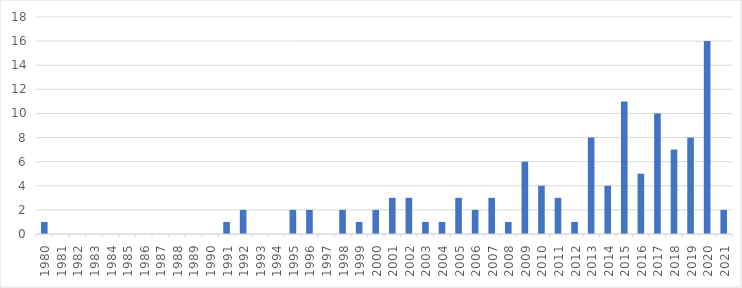
| Category | No. of articles, by year |
|---|---|
| 1980.0 | 1 |
| 1981.0 | 0 |
| 1982.0 | 0 |
| 1983.0 | 0 |
| 1984.0 | 0 |
| 1985.0 | 0 |
| 1986.0 | 0 |
| 1987.0 | 0 |
| 1988.0 | 0 |
| 1989.0 | 0 |
| 1990.0 | 0 |
| 1991.0 | 1 |
| 1992.0 | 2 |
| 1993.0 | 0 |
| 1994.0 | 0 |
| 1995.0 | 2 |
| 1996.0 | 2 |
| 1997.0 | 0 |
| 1998.0 | 2 |
| 1999.0 | 1 |
| 2000.0 | 2 |
| 2001.0 | 3 |
| 2002.0 | 3 |
| 2003.0 | 1 |
| 2004.0 | 1 |
| 2005.0 | 3 |
| 2006.0 | 2 |
| 2007.0 | 3 |
| 2008.0 | 1 |
| 2009.0 | 6 |
| 2010.0 | 4 |
| 2011.0 | 3 |
| 2012.0 | 1 |
| 2013.0 | 8 |
| 2014.0 | 4 |
| 2015.0 | 11 |
| 2016.0 | 5 |
| 2017.0 | 10 |
| 2018.0 | 7 |
| 2019.0 | 8 |
| 2020.0 | 16 |
| 2021.0 | 2 |